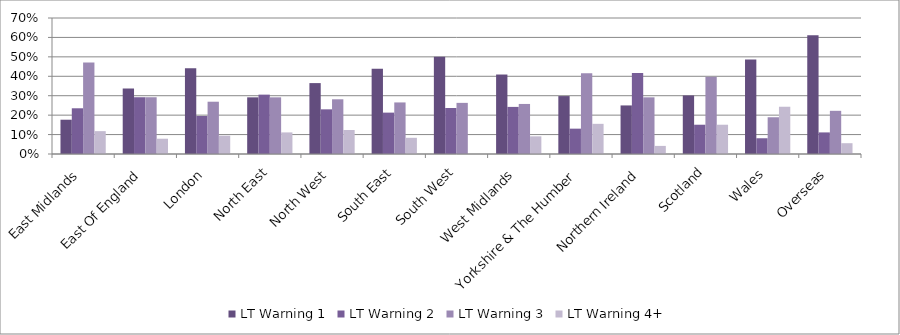
| Category | LT Warning 1 | LT Warning 2 | LT Warning 3 | LT Warning 4+ |
|---|---|---|---|---|
| East Midlands | 0.176 | 0.235 | 0.471 | 0.118 |
| East Of England | 0.337 | 0.292 | 0.292 | 0.079 |
| London | 0.441 | 0.196 | 0.269 | 0.094 |
| North East | 0.292 | 0.306 | 0.292 | 0.111 |
| North West | 0.365 | 0.23 | 0.282 | 0.124 |
| South East | 0.438 | 0.213 | 0.265 | 0.083 |
| South West | 0.5 | 0.237 | 0.263 | 0 |
| West Midlands | 0.409 | 0.242 | 0.258 | 0.091 |
| Yorkshire & The Humber | 0.298 | 0.13 | 0.416 | 0.155 |
| Northern Ireland | 0.25 | 0.417 | 0.292 | 0.042 |
| Scotland | 0.301 | 0.151 | 0.397 | 0.151 |
| Wales | 0.486 | 0.081 | 0.189 | 0.243 |
| Overseas | 0.611 | 0.111 | 0.222 | 0.056 |